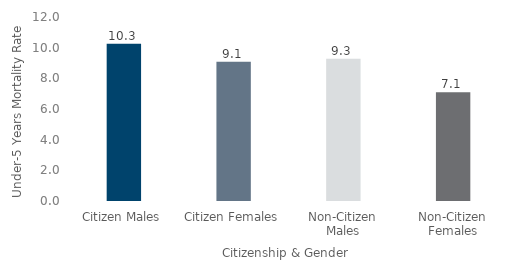
| Category | Series 0 |
|---|---|
| Citizen Males | 10.255 |
| Citizen Females | 9.079 |
| Non-Citizen Males | 9.278 |
| Non-Citizen Females | 7.098 |